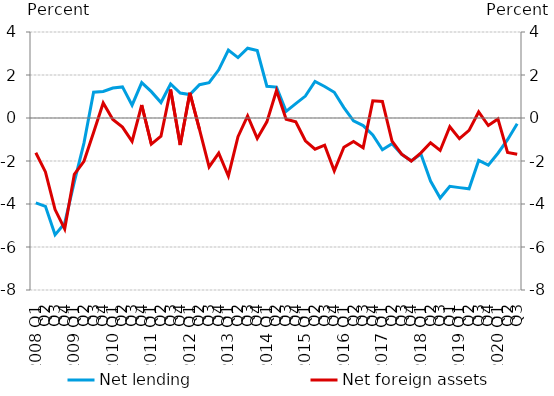
| Category | Net lending |
|---|---|
| 2008 Q1 | -3.951 |
| Q2 | -4.11 |
| Q3 | -5.434 |
| Q4 | -4.893 |
| 2009 Q1 | -2.97 |
| Q2 | -1.169 |
| Q3 | 1.199 |
| Q4 | 1.235 |
| 2010 Q1 | 1.392 |
| Q2 | 1.446 |
| Q3 | 0.595 |
| Q4 | 1.647 |
| 2011 Q1 | 1.225 |
| Q2 | 0.719 |
| Q3 | 1.58 |
| Q4 | 1.16 |
| 2012 Q1 | 1.091 |
| Q2 | 1.55 |
| Q3 | 1.64 |
| Q4 | 2.241 |
| 2013 Q1 | 3.161 |
| Q2 | 2.811 |
| Q3 | 3.245 |
| Q4 | 3.137 |
| 2014 Q1 | 1.477 |
| Q2 | 1.436 |
| Q3 | 0.308 |
| Q4 | 0.669 |
| 2015 Q1 | 1.02 |
| Q2 | 1.702 |
| Q3 | 1.465 |
| Q4 | 1.199 |
| 2016 Q1 | 0.485 |
| Q2 | -0.136 |
| Q3 | -0.351 |
| Q4 | -0.783 |
| 2017 Q1 | -1.474 |
| Q2 | -1.197 |
| Q3 | -1.69 |
| Q4 | -1.991 |
| 2018 Q1 | -1.677 |
| Q2 | -2.932 |
| Q3 | -3.725 |
| Q1 | -3.18 |
| 2019 Q1 | -3.239 |
| Q2 | -3.292 |
| Q3 | -1.973 |
| Q4 | -2.189 |
| 2020 Q1 | -1.638 |
| Q2 | -1.007 |
| Q3 | -0.268 |